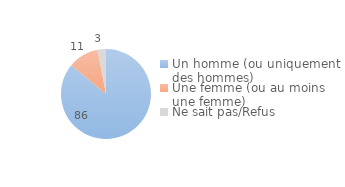
| Category | Series 0 |
|---|---|
| Un homme (ou uniquement des hommes) | 86 |
| Une femme (ou au moins une femme) | 11 |
| Ne sait pas/Refus | 3 |